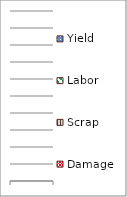
| Category | Damage | Scrap | Labor | Yield |
|---|---|---|---|---|
|  | 0 | 0 | 0 | 0 |